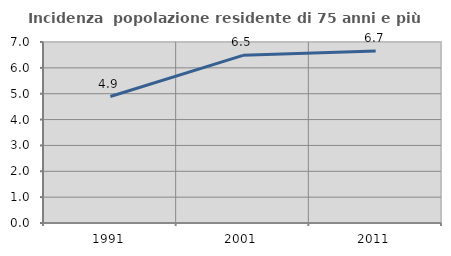
| Category | Incidenza  popolazione residente di 75 anni e più |
|---|---|
| 1991.0 | 4.892 |
| 2001.0 | 6.484 |
| 2011.0 | 6.653 |